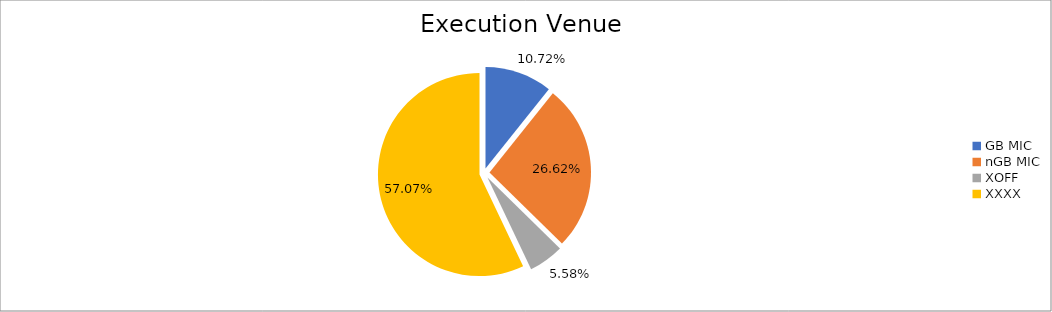
| Category | Series 0 |
|---|---|
| GB MIC | 932193.119 |
| nGB MIC | 2313779.947 |
| XOFF | 485449.955 |
| XXXX | 4961142.934 |